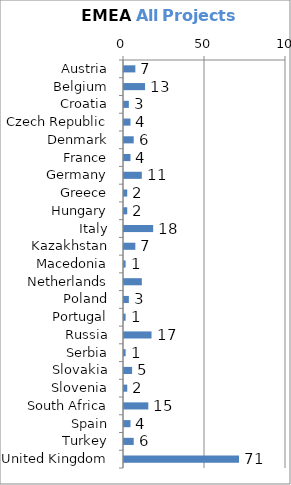
| Category | Total |
|---|---|
| Austria | 7 |
| Belgium | 13 |
| Croatia | 3 |
| Czech Republic | 4 |
| Denmark | 6 |
| France | 4 |
| Germany | 11 |
| Greece | 2 |
| Hungary | 2 |
| Italy | 18 |
| Kazakhstan | 7 |
| Macedonia | 1 |
| Netherlands | 11 |
| Poland | 3 |
| Portugal | 1 |
| Russia | 17 |
| Serbia | 1 |
| Slovakia | 5 |
| Slovenia | 2 |
| South Africa | 15 |
| Spain | 4 |
| Turkey | 6 |
| United Kingdom | 71 |